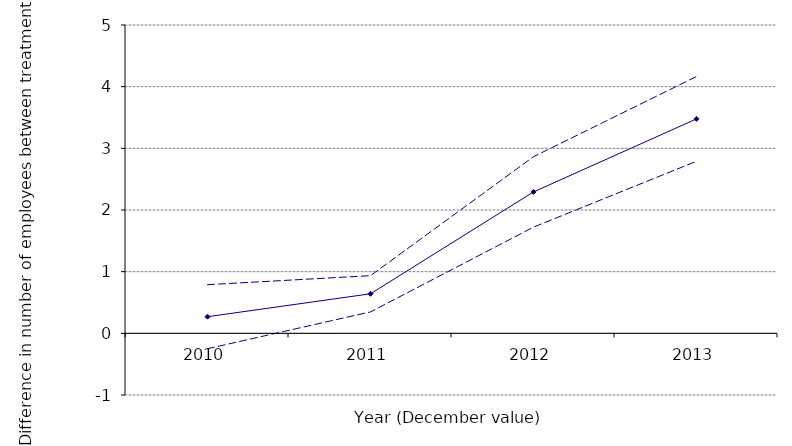
| Category | MeanDiff | FivePercent | NinetyFivePercent |
|---|---|---|---|
| 2010.0 | 0.27 | -0.25 | 0.789 |
| 2011.0 | 0.641 | 0.348 | 0.935 |
| 2012.0 | 2.293 | 1.722 | 2.864 |
| 2013.0 | 3.477 | 2.79 | 4.165 |